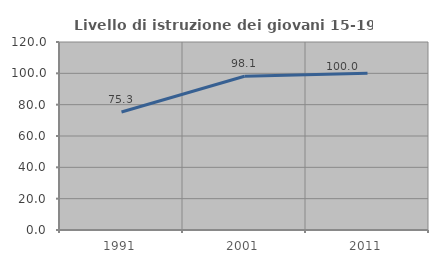
| Category | Livello di istruzione dei giovani 15-19 anni |
|---|---|
| 1991.0 | 75.342 |
| 2001.0 | 98.113 |
| 2011.0 | 100 |